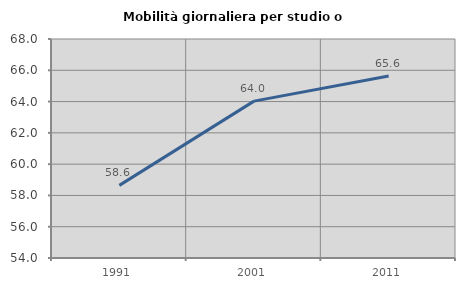
| Category | Mobilità giornaliera per studio o lavoro |
|---|---|
| 1991.0 | 58.644 |
| 2001.0 | 64.028 |
| 2011.0 | 65.63 |